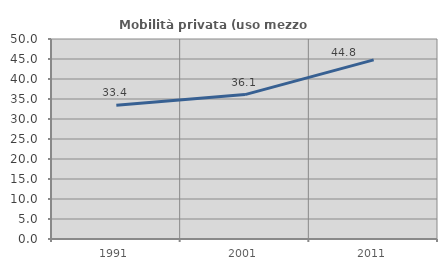
| Category | Mobilità privata (uso mezzo privato) |
|---|---|
| 1991.0 | 33.416 |
| 2001.0 | 36.097 |
| 2011.0 | 44.788 |